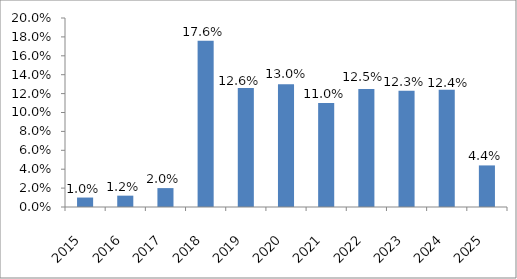
| Category | Series 0 |
|---|---|
| 2015.0 | 0.01 |
| 2016.0 | 0.012 |
| 2017.0 | 0.02 |
| 2018.0 | 0.176 |
| 2019.0 | 0.126 |
| 2020.0 | 0.13 |
| 2021.0 | 0.11 |
| 2022.0 | 0.125 |
| 2023.0 | 0.123 |
| 2024.0 | 0.124 |
| 2025.0 | 0.044 |